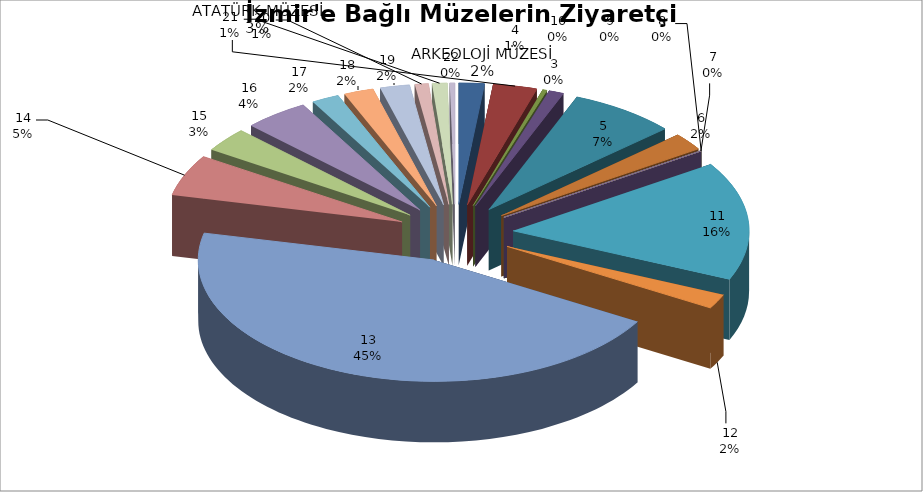
| Category | Series 0 |
|---|---|
| 0 | 1613 |
| 1 | 2783 |
| 2 | 273 |
| 3 | 948 |
| 4 | 6766 |
| 5 | 2132 |
| 6 | 42 |
| 7 | 0 |
| 8 | 0 |
| 9 | 0 |
| 10 | 14557 |
| 11 | 1789 |
| 12 | 41633 |
| 13 | 5076 |
| 14 | 2975 |
| 15 | 4120 |
| 16 | 1744 |
| 17 | 1877 |
| 18 | 1872 |
| 19 | 855 |
| 20 | 952 |
| 21 | 322 |